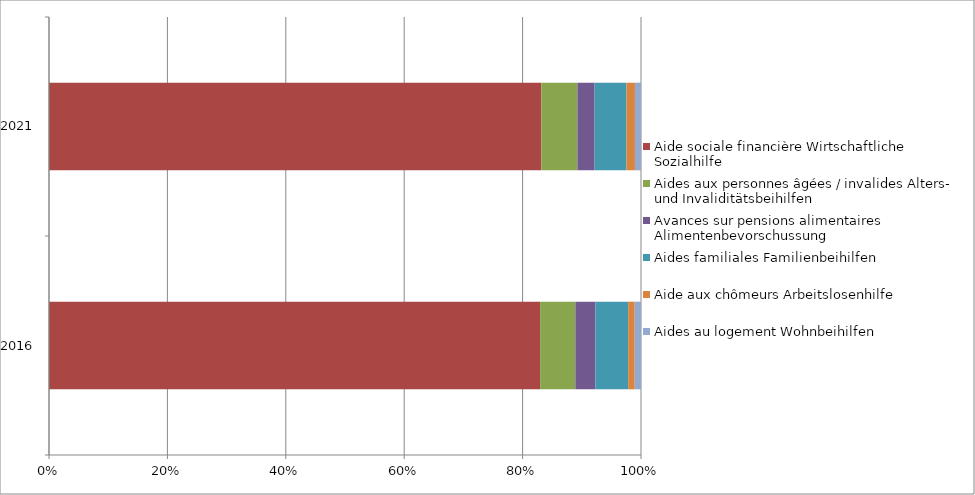
| Category | Aide sociale financière | Aides aux personnes âgées / invalides | Avances sur pensions alimentaires | Aides familiales | Aide aux chômeurs | Aides au logement |
|---|---|---|---|---|---|---|
| 2016.0 | 0.83 | 0.06 | 0.034 | 0.055 | 0.011 | 0.011 |
| 2021.0 | 0.832 | 0.061 | 0.029 | 0.054 | 0.014 | 0.01 |